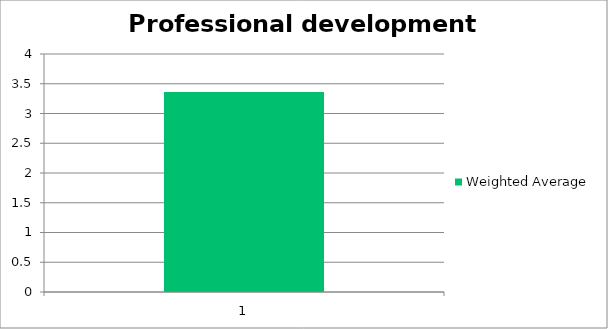
| Category | Weighted Average |
|---|---|
| 1.0 | 3.36 |